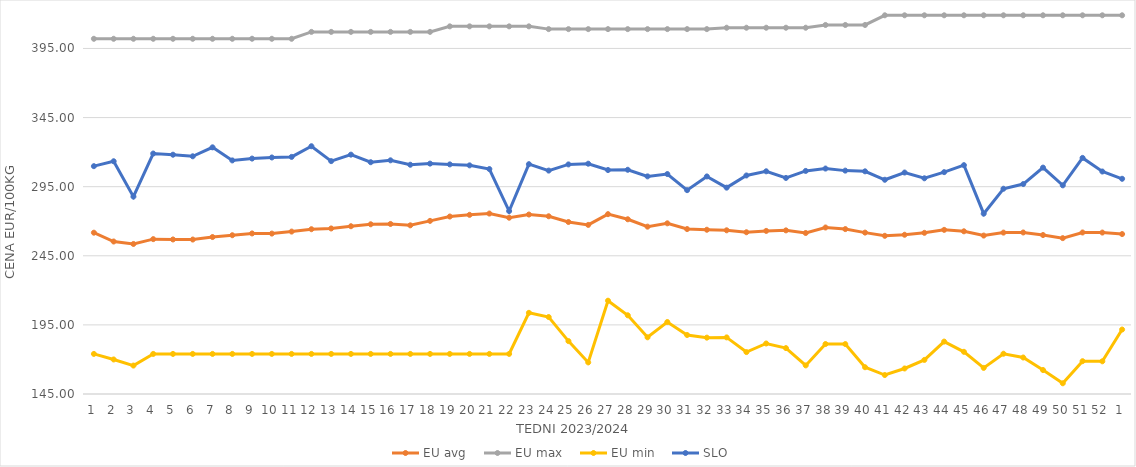
| Category | EU avg | EU max | EU min | SLO |
|---|---|---|---|---|
| 1.0 | 261.716 | 402 | 174 | 309.84 |
| 2.0 | 255.331 | 402 | 169.983 | 313.4 |
| 3.0 | 253.546 | 402 | 165.574 | 287.81 |
| 4.0 | 257.051 | 402 | 174 | 318.98 |
| 5.0 | 256.808 | 402 | 174 | 318.13 |
| 6.0 | 256.75 | 402 | 174 | 316.99 |
| 7.0 | 258.565 | 402 | 174 | 323.47 |
| 8.0 | 259.872 | 402 | 174 | 314 |
| 9.0 | 261.164 | 402 | 174 | 315.35 |
| 10.0 | 261.06 | 402 | 174 | 316.13 |
| 11.0 | 262.513 | 402 | 174 | 316.55 |
| 12.0 | 264.228 | 407 | 174 | 324.27 |
| 13.0 | 264.768 | 407 | 174 | 313.49 |
| 14.0 | 266.385 | 407 | 174 | 318.17 |
| 15.0 | 267.797 | 407 | 174 | 312.7 |
| 16.0 | 268.021 | 407 | 174 | 314.07 |
| 17.0 | 267.041 | 407 | 174 | 310.87 |
| 18.0 | 270.255 | 407 | 174 | 311.69 |
| 19.0 | 273.406 | 411 | 174 | 311.13 |
| 20.0 | 274.631 | 411 | 174 | 310.42 |
| 21.0 | 275.561 | 411 | 174 | 307.76 |
| 22.0 | 272.542 | 411 | 174 | 277.34 |
| 23.0 | 274.85 | 411 | 203.728 | 311.28 |
| 24.0 | 273.59 | 409 | 200.686 | 306.64 |
| 25.0 | 269.439 | 409 | 183.275 | 311.1 |
| 26.0 | 267.345 | 409 | 167.858 | 311.62 |
| 27.0 | 275.123 | 409 | 212.506 | 307.04 |
| 28.0 | 271.42 | 409 | 201.945 | 307.23 |
| 29.0 | 266.08 | 409 | 186.018 | 302.45 |
| 30.0 | 268.49 | 409 | 197.093 | 304.14 |
| 31.0 | 264.334 | 409 | 187.684 | 292.49 |
| 32.0 | 263.844 | 409 | 185.774 | 302.41 |
| 33.0 | 263.441 | 410 | 185.951 | 294.3 |
| 34.0 | 262.028 | 410 | 175.332 | 303.1 |
| 35.0 | 262.997 | 410 | 181.543 | 306.13 |
| 36.0 | 263.389 | 410 | 178.207 | 301.32 |
| 37.0 | 261.486 | 410 | 165.697 | 306.4 |
| 38.0 | 265.47 | 412 | 181.159 | 308.12 |
| 39.0 | 264.316 | 412 | 181.124 | 306.62 |
| 40.0 | 261.774 | 412 | 164.37 | 306.1 |
| 41.0 | 259.456 | 419 | 158.728 | 300 |
| 42.0 | 260.21 | 419 | 163.464 | 305.24 |
| 43.0 | 261.605 | 419 | 169.66 | 301.07 |
| 44.0 | 263.758 | 419 | 182.925 | 305.52 |
| 45.0 | 262.714 | 419 | 175.524 | 310.58 |
| 46.0 | 259.625 | 419 | 163.882 | 275.46 |
| 47.0 | 261.772 | 419 | 174.136 | 293.51 |
| 48.0 | 261.864 | 419 | 171.4 | 296.9 |
| 49.0 | 260.014 | 419 | 162.336 | 308.8 |
| 50.0 | 257.768 | 419 | 152.762 | 295.97 |
| 51.0 | 261.869 | 419 | 168.739 | 315.82 |
| 52.0 | 261.805 | 419 | 168.659 | 305.97 |
| 1.0 | 260.72 | 419 | 191.64 | 300.71 |